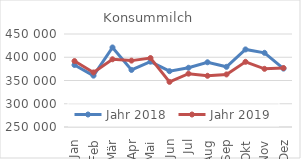
| Category | Jahr 2018 | Jahr 2019 |
|---|---|---|
| Jan | 383386.199 | 391803.61 |
| Feb | 360430.09 | 367355.745 |
| Mär | 421087.812 | 395632.529 |
| Apr | 372729.214 | 392770.41 |
| Mai | 390471.051 | 398324.01 |
| Jun | 370030.744 | 347044.952 |
| Jul | 377418.838 | 364679.555 |
| Aug | 389232.929 | 360122.493 |
| Sep | 379395.974 | 363094.844 |
| Okt | 416799.856 | 390142.133 |
| Nov | 409518.688 | 375118.037 |
| Dez | 375600.667 | 376887.332 |